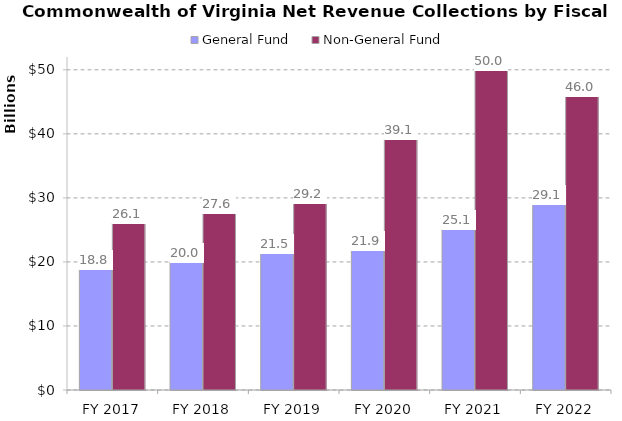
| Category | General Fund | Non-General Fund  |
|---|---|---|
| FY 2017 | 18839827000 | 26073523000 |
| FY 2018 | 20024020000 | 27608806000 |
| FY 2019 | 21467094000 | 29225445000 |
| FY 2020 | 21903571000 | 39119584000 |
| FY 2021 | 25083803000 | 50027817000 |
| FY 2022 | 29093520000 | 45970780000 |